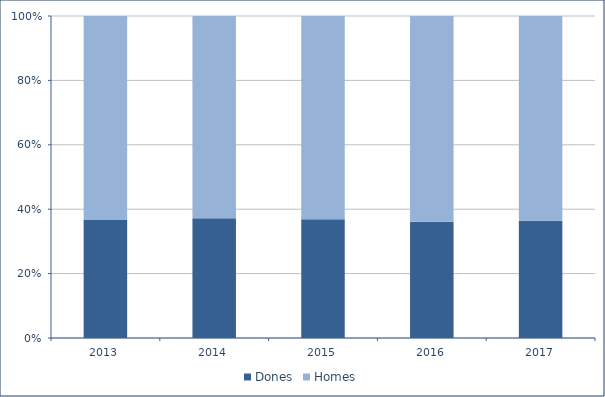
| Category | Dones | Homes |
|---|---|---|
| 2013.0 | 1854 | 3185 |
| 2014.0 | 1799 | 3034 |
| 2015.0 | 1787 | 3060 |
| 2016.0 | 1810 | 3202 |
| 2017.0 | 1870 | 3266 |